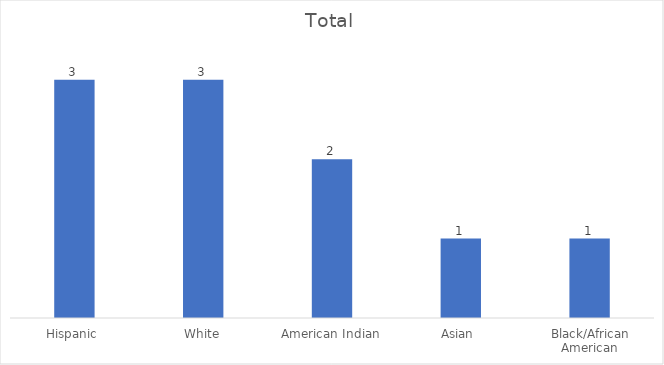
| Category | Total |
|---|---|
| Hispanic | 3 |
| White | 3 |
| American Indian | 2 |
| Asian  | 1 |
| Black/African American | 1 |